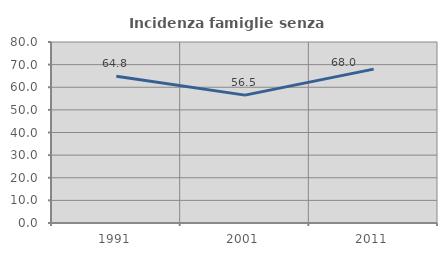
| Category | Incidenza famiglie senza nuclei |
|---|---|
| 1991.0 | 64.835 |
| 2001.0 | 56.522 |
| 2011.0 | 68 |